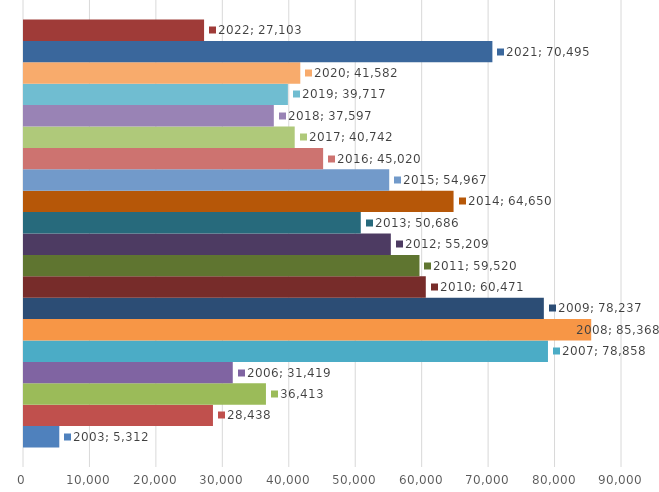
| Category | 2003 | 2004 | 2005 | 2006 | 2007 | 2008 | 2009 | 2010 | 2011 | 2012 | 2013 | 2014 | 2015 | 2016 | 2017 | 2018 | 2019 | 2020 | 2021 | 2022 |
|---|---|---|---|---|---|---|---|---|---|---|---|---|---|---|---|---|---|---|---|---|
| 0 | 5312 | 28438 | 36413 | 31419 | 78858 | 85368 | 78237 | 60471 | 59520 | 55209 | 50686 | 64650 | 54967 | 45020 | 40742 | 37597 | 39717 | 41582 | 70495 | 27103 |